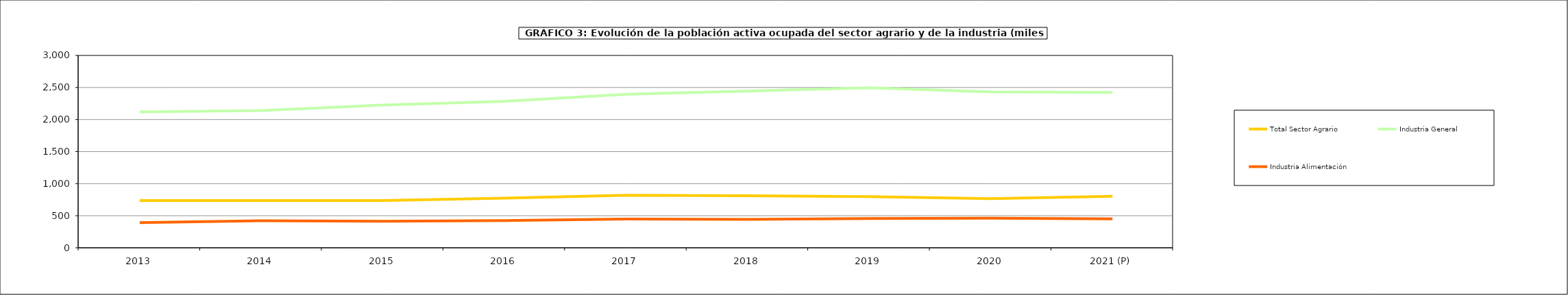
| Category | Total Sector Agrario | Industria General | Industria Alimentación |
|---|---|---|---|
| 2013 | 736.6 | 2118.7 | 393.3 |
| 2014 | 735.85 | 2141.4 | 420.65 |
| 2015 | 736.75 | 2225.025 | 414.025 |
| 2016 | 774.5 | 2284.2 | 423.7 |
| 2017 | 819.5 | 2393.4 | 448 |
| 2018 | 812.575 | 2444.2 | 442.4 |
| 2019 | 797.275 | 2494.925 | 456.05 |
| 2020 | 765.35 | 2431.225 | 460.475 |
| 2021 (P) | 802.65 | 2422.925 | 452 |